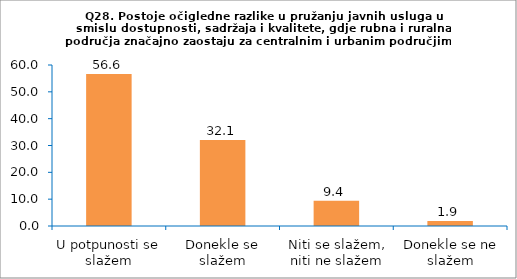
| Category | Series 0 |
|---|---|
| U potpunosti se slažem | 56.604 |
| Donekle se slažem | 32.075 |
| Niti se slažem, niti ne slažem | 9.434 |
| Donekle se ne slažem | 1.887 |